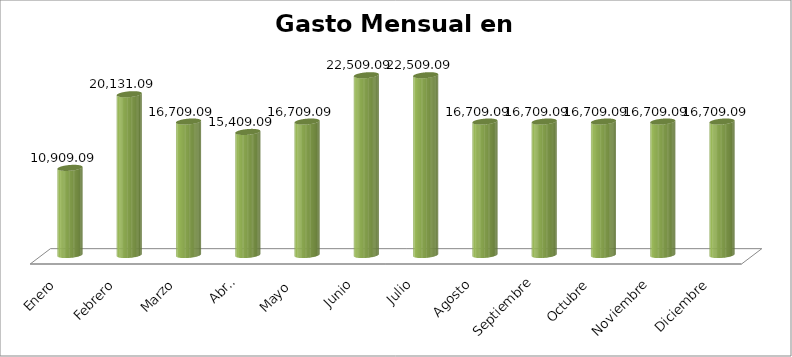
| Category | Suma |
|---|---|
| Enero | 10909.09 |
| Febrero | 20131.09 |
| Marzo | 16709.09 |
| Abril | 15409.09 |
| Mayo  | 16709.09 |
| Junio | 22509.09 |
| Julio | 22509.09 |
| Agosto | 16709.09 |
| Septiembre | 16709.09 |
| Octubre | 16709.09 |
| Noviembre | 16709.09 |
| Diciembre | 16709.09 |